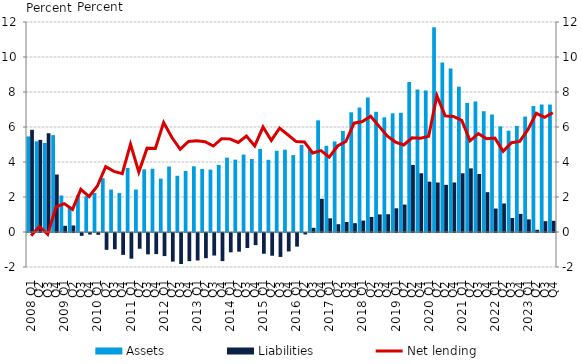
| Category | Assets | Liabilities |
|---|---|---|
| 2008 Q1 | 5.462 | 5.839 |
| Q2 | 5.181 | 5.265 |
| Q3 | 5.087 | 5.644 |
| Q4 | 5.537 | 3.285 |
| 2009 Q1 | 2.086 | 0.354 |
| Q2 | 1.456 | 0.372 |
| Q3 | 2.105 | -0.164 |
| Q4 | 2.045 | -0.088 |
| 2010 Q1 | 2.232 | -0.104 |
| Q2 | 3.074 | -0.961 |
| Q3 | 2.425 | -0.928 |
| Q4 | 2.222 | -1.249 |
| 2011 Q1 | 3.657 | -1.468 |
| Q2 | 2.429 | -0.9 |
| Q3 | 3.579 | -1.222 |
| Q4 | 3.617 | -1.205 |
| 2012 Q1 | 3.052 | -1.32 |
| Q2 | 3.743 | -1.634 |
| Q3 | 3.213 | -1.77 |
| Q4 | 3.491 | -1.609 |
| 2013 Q1 | 3.756 | -1.57 |
| Q2 | 3.605 | -1.439 |
| Q3 | 3.565 | -1.288 |
| Q4 | 3.833 | -1.607 |
| 2014 Q1 | 4.25 | -1.103 |
| Q2 | 4.134 | -1.065 |
| Q3 | 4.424 | -0.856 |
| Q4 | 4.172 | -0.695 |
| 2015 Q1 | 4.747 | -1.186 |
| Q2 | 4.124 | -1.298 |
| Q3 | 4.642 | -1.369 |
| Q4 | 4.702 | -1.054 |
| 2016 Q1 | 4.394 | -0.779 |
| Q2 | 4.974 | -0.083 |
| Q3 | 4.698 | 0.237 |
| Q4 | 6.381 | 1.896 |
| 2017 Q1 | 4.927 | 0.783 |
| Q2 | 5.177 | 0.446 |
| Q3 | 5.775 | 0.571 |
| Q4 | 6.84 | 0.504 |
| 2018 Q1 | 7.113 | 0.652 |
| Q2 | 7.684 | 0.862 |
| Q3 | 6.87 | 1.004 |
| Q4 | 6.556 | 1.017 |
| 2019 Q1 | 6.783 | 1.355 |
| Q2 | 6.812 | 1.566 |
| Q2 | 8.575 | 3.834 |
| Q4 | 8.138 | 3.357 |
| 2020 Q1 | 8.087 | 2.875 |
| Q2 | 11.699 | 2.829 |
| Q2 | 9.688 | 2.695 |
| Q4 | 9.341 | 2.83 |
|  2021 Q1 | 8.305 | 3.355 |
| Q2 | 7.369 | 3.636 |
| Q3 | 7.454 | 3.315 |
| Q4 | 6.902 | 2.275 |
| 2022 Q1 | 6.718 | 1.341 |
| Q2 | 6.033 | 1.63 |
| Q3 | 5.789 | 0.8 |
| Q4 | 6.061 | 1.035 |
| 2023 Q1 | 6.596 | 0.722 |
| Q2 | 7.199 | 0.128 |
| Q3 | 7.282 | 0.62 |
| Q4 | 7.284 | 0.64 |